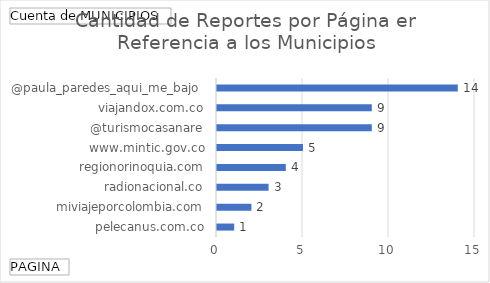
| Category | Total |
|---|---|
| pelecanus.com.co | 1 |
| miviajeporcolombia.com | 2 |
| radionacional.co | 3 |
| regionorinoquia.com | 4 |
| www.mintic.gov.co | 5 |
| @turismocasanare | 9 |
| viajandox.com.co | 9 |
| @paula_paredes_aqui_me_bajo  | 14 |